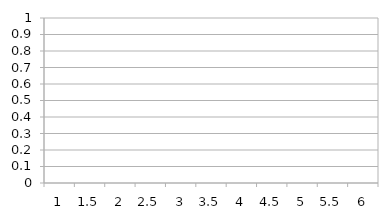
| Category | Series 0 |
|---|---|
| 1 | 0 |
| 1.5 | 0 |
| 2 | 0 |
| 2.5 | 0 |
| 3 | 0 |
| 3.5 | 0 |
| 4 | 0 |
| 4.5 | 0 |
| 5 | 0 |
| 5.5 | 0 |
| 6 | 0 |